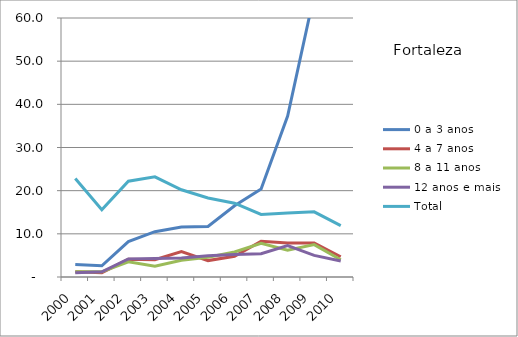
| Category | 0 a 3 anos | 4 a 7 anos | 8 a 11 anos | 12 anos e mais | Total |
|---|---|---|---|---|---|
| 2000.0 | 2.9 | 1.2 | 1.2 | 1 | 22.8 |
| 2001.0 | 2.6 | 1 | 1.2 | 1.2 | 15.6 |
| 2002.0 | 8.2 | 4.1 | 3.5 | 4.2 | 22.2 |
| 2003.0 | 10.5 | 4 | 2.5 | 4.3 | 23.2 |
| 2004.0 | 11.6 | 5.9 | 3.9 | 4.4 | 20.2 |
| 2005.0 | 11.7 | 3.8 | 4.6 | 4.9 | 18.3 |
| 2006.0 | 16.5 | 4.8 | 5.8 | 5.2 | 17.1 |
| 2007.0 | 20.4 | 8.3 | 7.8 | 5.4 | 14.5 |
| 2008.0 | 37.3 | 7.9 | 6.2 | 7.3 | 14.8 |
| 2009.0 | 65.4 | 7.9 | 7.5 | 5 | 15.1 |
| 2010.0 | 87.7 | 4.7 | 4 | 3.7 | 11.9 |